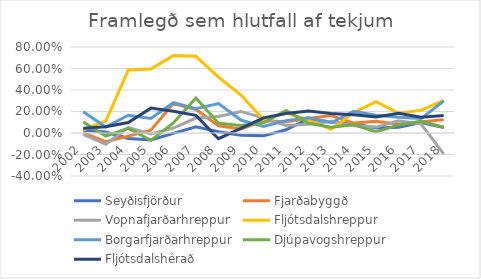
| Category | Seyðisfjörður | Fjarðabyggð | Vopnafjarðarhreppur | Fljótsdalshreppur | Borgarfjarðarhreppur | Djúpavogshreppur | Fljótsdalshérað |
|---|---|---|---|---|---|---|---|
| 2002.0 | 0.026 | 0.002 | -0.013 | 0.029 | 0.197 | 0.103 | 0.044 |
| 2003.0 | 0.009 | -0.081 | -0.104 | 0.112 | 0.055 | -0.028 | 0.058 |
| 2004.0 | -0.051 | -0.029 | 0.05 | 0.586 | 0.165 | 0.043 | 0.097 |
| 2005.0 | -0.065 | 0.026 | -0.008 | 0.596 | 0.135 | -0.068 | 0.231 |
| 2006.0 | -0.004 | 0.273 | 0.046 | 0.72 | 0.282 | 0.093 | 0.202 |
| 2007.0 | 0.057 | 0.219 | 0.139 | 0.714 | 0.225 | 0.325 | 0.164 |
| 2008.0 | 0.012 | 0.067 | 0.154 | 0.521 | 0.273 | 0.091 | -0.053 |
| 2009.0 | -0.021 | 0.037 | 0.2 | 0.353 | 0.12 | 0.069 | 0.043 |
| 2010.0 | -0.027 | 0.114 | 0.141 | 0.124 | 0.06 | 0.096 | 0.141 |
| 2011.0 | 0.03 | 0.105 | 0.069 | 0.185 | 0.115 | 0.21 | 0.181 |
| 2012.0 | 0.133 | 0.135 | 0.082 | 0.121 | 0.142 | 0.091 | 0.204 |
| 2013.0 | 0.102 | 0.162 | 0.108 | 0.034 | 0.096 | 0.054 | 0.181 |
| 2014.0 | 0.087 | 0.092 | 0.068 | 0.19 | 0.201 | 0.078 | 0.17 |
| 2015.0 | 0.046 | 0.108 | 0.055 | 0.292 | 0.165 | 0.01 | 0.15 |
| 2016.0 | 0.053 | 0.081 | 0.113 | 0.184 | 0.147 | 0.075 | 0.183 |
| 2017.0 | 0.098 | 0.104 | 0.082 | 0.212 | 0.136 | 0.11 | 0.146 |
| 2018.0 | 0.05 | 0.124 | -0.197 | 0.303 | 0.298 | 0.054 | 0.163 |